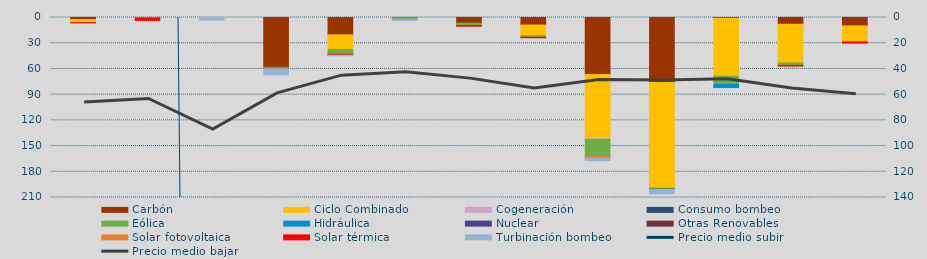
| Category | Carbón | Ciclo Combinado | Cogeneración | Consumo bombeo | Eólica | Hidráulica | Nuclear | Otras Renovables | Solar fotovoltaica | Solar térmica | Turbinación bombeo |
|---|---|---|---|---|---|---|---|---|---|---|---|
| 0 | 2438 | 3386 | 0 |  | 274 | 0 |  | 0 | 0 | 117.8 | 0 |
| 1 | 0 | 0 | 0 |  | 0 | 1009.1 |  | 0 | 0 | 2368.1 | 0 |
| 2 | 0 | 400 | 0 |  | 0 | 0 |  | 0 | 0 | 0 | 2763.2 |
| 3 | 58033.7 | 0 | 0 |  | 988.1 | 1026.5 |  | 0 | 57.8 | 0 | 6933.6 |
| 4 | 20255.7 | 17094 | 0 |  | 5344.3 | 623 |  | 0 | 0 | 617.6 | 755.1 |
| 5 | 158.4 | 0 | 0 |  | 1844.3 | 12 |  | 0 | 0 | 0 | 1460 |
| 6 | 6575 | 0 | 0 |  | 2859 | 0 |  | 0 | 0 | 725.3 | 0 |
| 7 | 8771 | 12552 | 0 |  | 1652.9 | 70 |  | 0 | 0 | 608.7 | 0 |
| 8 | 66423 | 75034.9 | 910.1 |  | 19943.3 | 36 |  | 0 | 1820.4 | 0 | 2822.9 |
| 9 | 75870.4 | 123130.8 | 0 |  | 1278.3 | 0 |  | 288.4 | 0 | 0 | 5090.1 |
| 10 | 802.5 | 67762.6 | 0 |  | 9561.7 | 4762.5 |  | 0 | 0 | 0 | 0 |
| 11 | 7913 | 45184 | 0 |  | 2732.2 | 54.3 |  | 0 | 0 | 784 | 0 |
| 12 | 9798 | 18106.5 | 0 |  | 568.3 | 428.4 |  | 0 | 0 | 944 | 0 |